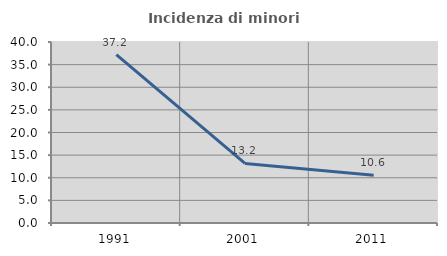
| Category | Incidenza di minori stranieri |
|---|---|
| 1991.0 | 37.209 |
| 2001.0 | 13.158 |
| 2011.0 | 10.573 |